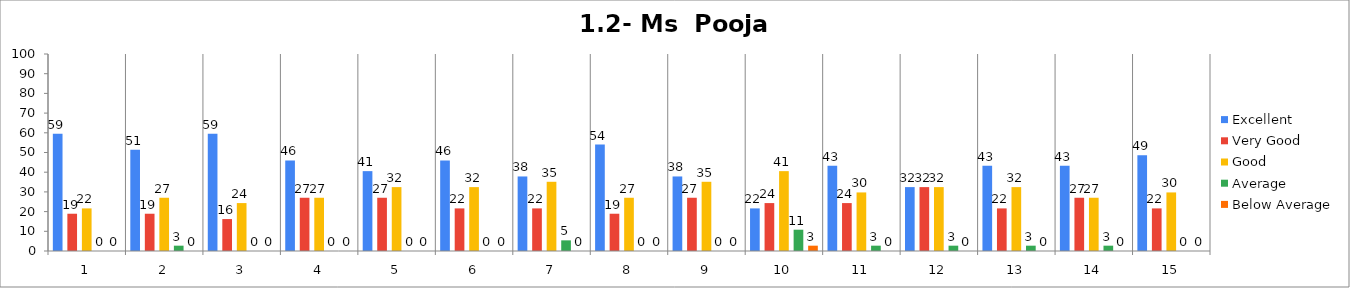
| Category | Excellent | Very Good | Good | Average | Below Average |
|---|---|---|---|---|---|
| 0 | 59.459 | 18.919 | 21.622 | 0 | 0 |
| 1 | 51.351 | 18.919 | 27.027 | 2.703 | 0 |
| 2 | 59.459 | 16.216 | 24.324 | 0 | 0 |
| 3 | 45.946 | 27.027 | 27.027 | 0 | 0 |
| 4 | 40.541 | 27.027 | 32.432 | 0 | 0 |
| 5 | 45.946 | 21.622 | 32.432 | 0 | 0 |
| 6 | 37.838 | 21.622 | 35.135 | 5.405 | 0 |
| 7 | 54.054 | 18.919 | 27.027 | 0 | 0 |
| 8 | 37.838 | 27.027 | 35.135 | 0 | 0 |
| 9 | 21.622 | 24.324 | 40.541 | 10.811 | 2.703 |
| 10 | 43.243 | 24.324 | 29.73 | 2.703 | 0 |
| 11 | 32.432 | 32.432 | 32.432 | 2.703 | 0 |
| 12 | 43.243 | 21.622 | 32.432 | 2.703 | 0 |
| 13 | 43.243 | 27.027 | 27.027 | 2.703 | 0 |
| 14 | 48.649 | 21.622 | 29.73 | 0 | 0 |